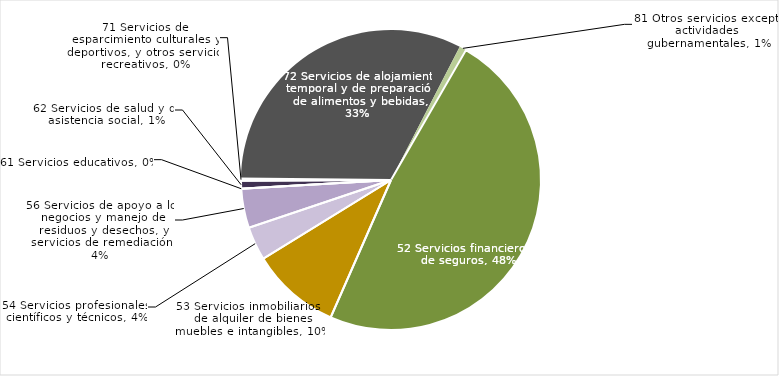
| Category | Series 0 |
|---|---|
| 52 Servicios financieros y de seguros | 0.485 |
| 53 Servicios inmobiliarios y de alquiler de bienes muebles e intangibles | 0.097 |
| 54 Servicios profesionales, científicos y técnicos | 0.037 |
| 56 Servicios de apoyo a los negocios y manejo de residuos y desechos, y servicios de remediación | 0.042 |
| 61 Servicios educativos | 0 |
| 62 Servicios de salud y de asistencia social | 0.009 |
| 71 Servicios de esparcimiento culturales y deportivos, y otros servicios recreativos | -0.002 |
| 72 Servicios de alojamiento temporal y de preparación de alimentos y bebidas | 0.326 |
| 81 Otros servicios excepto actividades gubernamentales | 0.008 |